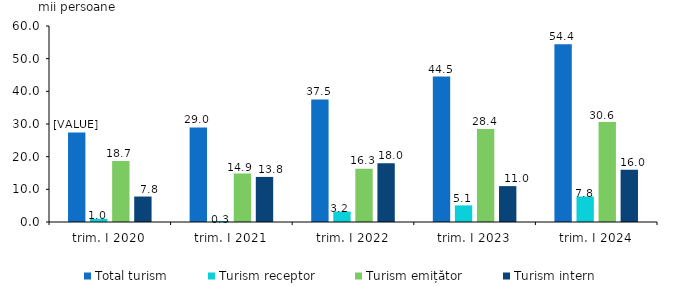
| Category | Total turism | Turism receptor | Turism emițător | Turism intern |
|---|---|---|---|---|
| trim. I 2020 | 27.432 | 0.967 | 18.667 | 7.798 |
| trim. I 2021 | 28.958 | 0.306 | 14.856 | 13.796 |
| trim. I 2022 | 37.532 | 3.217 | 16.327 | 17.989 |
| trim. I 2023 | 44.513 | 5.09 | 28.437 | 10.986 |
| trim. I 2024 | 54.4 | 7.8 | 30.6 | 16 |